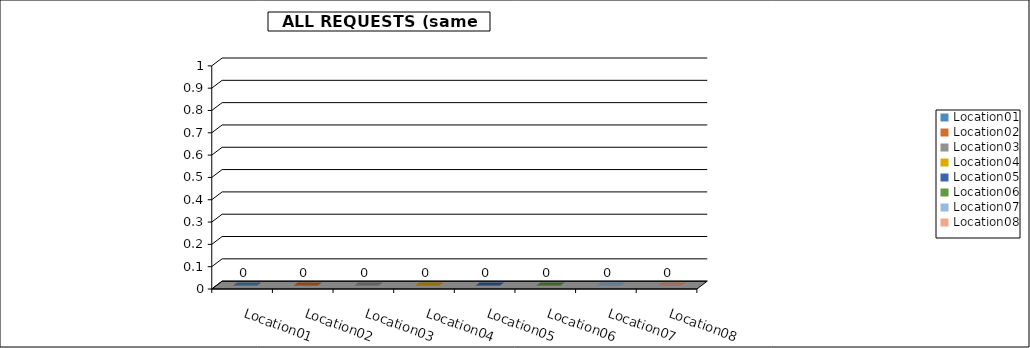
| Category | Series 0 |
|---|---|
| Location01 | 0 |
| Location02 | 0 |
| Location03 | 0 |
| Location04 | 0 |
| Location05 | 0 |
| Location06 | 0 |
| Location07 | 0 |
| Location08 | 0 |